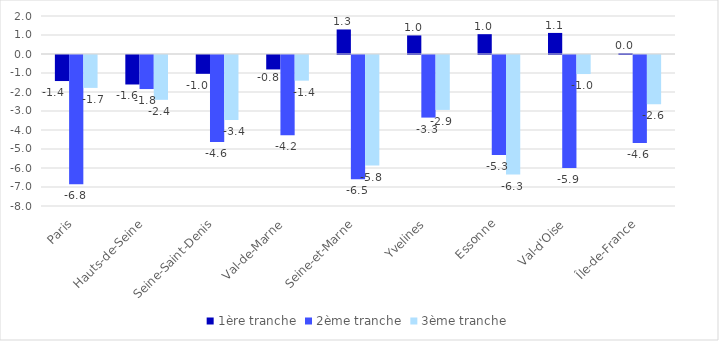
| Category | 1ère tranche | 2ème tranche | 3ème tranche |
|---|---|---|---|
| Paris | -1.371 | -6.803 | -1.732 |
| Hauts-de-Seine | -1.552 | -1.792 | -2.359 |
| Seine-Saint-Denis | -0.99 | -4.579 | -3.424 |
| Val-de-Marne | -0.76 | -4.22 | -1.352 |
| Seine-et-Marne | 1.292 | -6.54 | -5.819 |
| Yvelines | 0.977 | -3.294 | -2.89 |
| Essonne | 1.043 | -5.265 | -6.294 |
| Val-d'Oise | 1.109 | -5.942 | -1.002 |
| Île-de-France | 0.038 | -4.627 | -2.592 |